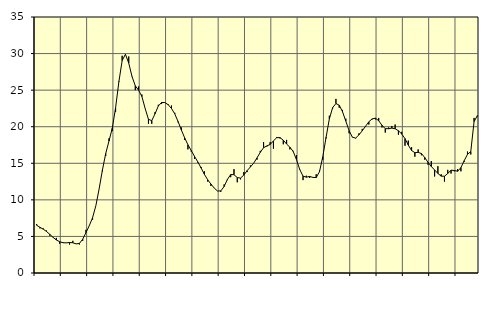
| Category | Piggar | Series 1 |
|---|---|---|
| nan | 6.7 | 6.53 |
| 87.0 | 6.1 | 6.25 |
| 87.0 | 6.1 | 5.99 |
| 87.0 | 5.8 | 5.68 |
| nan | 5.1 | 5.28 |
| 88.0 | 4.9 | 4.87 |
| 88.0 | 4.8 | 4.51 |
| 88.0 | 4 | 4.28 |
| nan | 4.2 | 4.14 |
| 89.0 | 4.1 | 4.12 |
| 89.0 | 3.9 | 4.17 |
| 89.0 | 4.4 | 4.13 |
| nan | 4 | 3.98 |
| 90.0 | 3.9 | 4.04 |
| 90.0 | 4.4 | 4.62 |
| 90.0 | 5.9 | 5.52 |
| nan | 6.5 | 6.47 |
| 91.0 | 7.3 | 7.55 |
| 91.0 | 9.2 | 9.2 |
| 91.0 | 11.5 | 11.5 |
| nan | 13.9 | 14.08 |
| 92.0 | 16 | 16.33 |
| 92.0 | 18.4 | 18.05 |
| 92.0 | 19.4 | 19.8 |
| nan | 22 | 22.57 |
| 93.0 | 26.2 | 26.13 |
| 93.0 | 29.7 | 29.04 |
| 93.0 | 29.8 | 29.9 |
| nan | 29.6 | 28.7 |
| 94.0 | 26.9 | 26.86 |
| 94.0 | 25 | 25.59 |
| 94.0 | 25.5 | 24.99 |
| nan | 24.4 | 24.13 |
| 95.0 | 22.5 | 22.48 |
| 95.0 | 20.4 | 21.01 |
| 95.0 | 20.4 | 20.83 |
| nan | 22 | 21.77 |
| 96.0 | 23 | 22.83 |
| 96.0 | 23.1 | 23.32 |
| 96.0 | 23.3 | 23.3 |
| nan | 23.1 | 23.01 |
| 97.0 | 22.9 | 22.49 |
| 97.0 | 21.9 | 21.75 |
| 97.0 | 20.6 | 20.71 |
| nan | 19.9 | 19.56 |
| 98.0 | 18.2 | 18.48 |
| 98.0 | 16.9 | 17.53 |
| 98.0 | 16.6 | 16.75 |
| nan | 15.6 | 15.95 |
| 99.0 | 15.1 | 15.19 |
| 99.0 | 14.5 | 14.36 |
| 99.0 | 13.9 | 13.49 |
| nan | 12.5 | 12.75 |
| 0.0 | 11.9 | 12.16 |
| 0.0 | 11.6 | 11.61 |
| 0.0 | 11.2 | 11.21 |
| nan | 11.1 | 11.23 |
| 1.0 | 12.1 | 11.82 |
| 1.0 | 12.7 | 12.79 |
| 1.0 | 13.1 | 13.46 |
| nan | 14.2 | 13.44 |
| 2.0 | 12.4 | 13.04 |
| 2.0 | 12.8 | 12.98 |
| 2.0 | 13.8 | 13.39 |
| nan | 13.8 | 14 |
| 3.0 | 14.7 | 14.5 |
| 3.0 | 15 | 15.02 |
| 3.0 | 15.5 | 15.74 |
| nan | 16.7 | 16.5 |
| 4.0 | 17.9 | 17.13 |
| 4.0 | 17.3 | 17.38 |
| 4.0 | 17.9 | 17.57 |
| nan | 17 | 18.06 |
| 5.0 | 18.6 | 18.5 |
| 5.0 | 18.4 | 18.51 |
| 5.0 | 17.6 | 18.15 |
| nan | 18.2 | 17.63 |
| 6.0 | 16.9 | 17.2 |
| 6.0 | 16.7 | 16.62 |
| 6.0 | 16.1 | 15.51 |
| nan | 14.2 | 14.15 |
| 7.0 | 12.7 | 13.24 |
| 7.0 | 13.3 | 13.1 |
| 7.0 | 13 | 13.2 |
| nan | 13.1 | 13.07 |
| 8.0 | 13.5 | 13.05 |
| 8.0 | 14 | 13.85 |
| 8.0 | 15.5 | 15.88 |
| nan | 18.4 | 18.55 |
| 9.0 | 21.5 | 21.07 |
| 9.0 | 22.5 | 22.61 |
| 9.0 | 23.8 | 23.17 |
| nan | 22.6 | 22.94 |
| 10.0 | 22.3 | 22.05 |
| 10.0 | 21.1 | 20.77 |
| 10.0 | 19.1 | 19.46 |
| nan | 18.6 | 18.57 |
| 11.0 | 18.4 | 18.45 |
| 11.0 | 19.1 | 18.89 |
| 11.0 | 19.7 | 19.44 |
| nan | 20 | 20.06 |
| 12.0 | 20.3 | 20.67 |
| 12.0 | 21 | 21.07 |
| 12.0 | 21 | 21.17 |
| nan | 21.2 | 20.82 |
| 13.0 | 19.9 | 20.19 |
| 13.0 | 19.2 | 19.73 |
| 13.0 | 19.9 | 19.73 |
| nan | 20.1 | 19.81 |
| 14.0 | 20.3 | 19.72 |
| 14.0 | 18.9 | 19.45 |
| 14.0 | 19.3 | 19.01 |
| nan | 17.4 | 18.37 |
| 15.0 | 18.1 | 17.49 |
| 15.0 | 17.2 | 16.75 |
| 15.0 | 15.9 | 16.45 |
| nan | 16.9 | 16.49 |
| 16.0 | 16.1 | 16.33 |
| 16.0 | 15.5 | 15.79 |
| 16.0 | 14.8 | 15.13 |
| nan | 15.3 | 14.56 |
| 17.0 | 13.2 | 14.09 |
| 17.0 | 14.6 | 13.61 |
| 17.0 | 13.5 | 13.24 |
| nan | 12.5 | 13.23 |
| 18.0 | 14.1 | 13.6 |
| 18.0 | 13.6 | 14.05 |
| 18.0 | 13.9 | 14.02 |
| nan | 14.2 | 13.91 |
| 19.0 | 13.9 | 14.41 |
| 19.0 | 15.2 | 15.35 |
| 19.0 | 16.6 | 16.23 |
| nan | 16.2 | 16.6 |
| 20.0 | 21.2 | 20.7 |
| 20.0 | 21.4 | 21.51 |